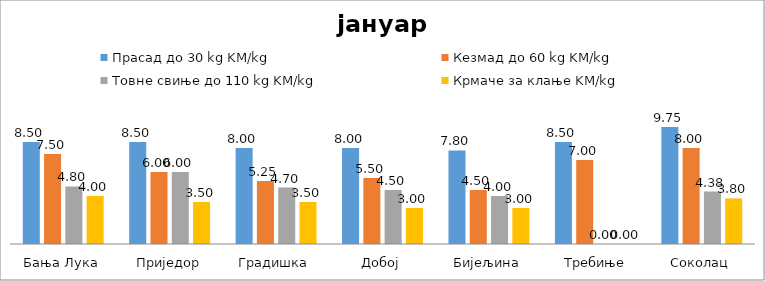
| Category | Прасад до 30 kg KM/kg | Кезмад до 60 kg KM/kg | Товне свиње до 110 kg KM/kg | Крмаче за клање KM/kg |
|---|---|---|---|---|
| Бања Лука | 8.5 | 7.5 | 4.8 | 4 |
| Приједор | 8.5 | 6 | 6 | 3.5 |
| Градишка | 8 | 5.25 | 4.7 | 3.5 |
| Добој | 8 | 5.5 | 4.5 | 3 |
| Бијељина | 7.8 | 4.5 | 4 | 3 |
|  Требиње | 8.5 | 7 | 0 | 0 |
| Соколац | 9.75 | 8 | 4.375 | 3.8 |